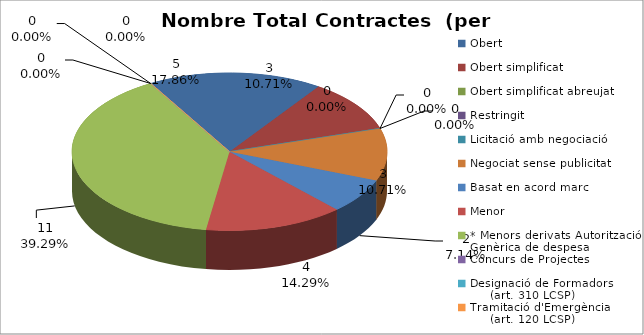
| Category | Nombre Total Contractes |
|---|---|
| Obert | 5 |
| Obert simplificat | 3 |
| Obert simplificat abreujat | 0 |
| Restringit | 0 |
| Licitació amb negociació | 0 |
| Negociat sense publicitat | 3 |
| Basat en acord marc | 2 |
| Menor | 4 |
| * Menors derivats Autorització Genèrica de despesa | 11 |
| Concurs de Projectes | 0 |
| Designació de Formadors
     (art. 310 LCSP) | 0 |
| Tramitació d'Emergència
     (art. 120 LCSP) | 0 |